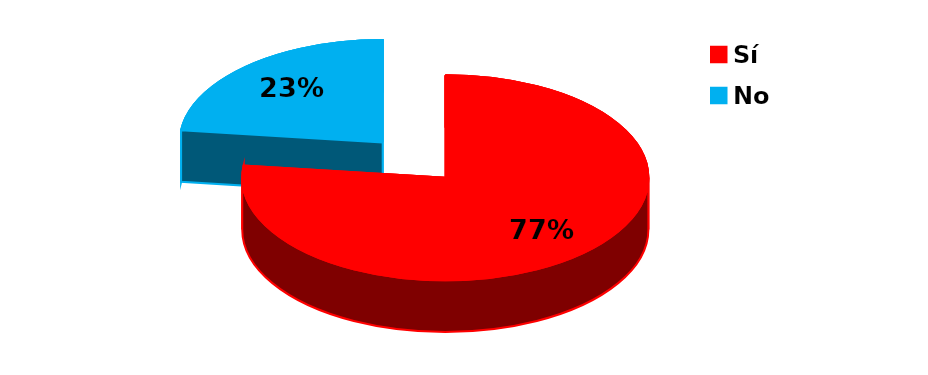
| Category | Series 0 |
|---|---|
| Sí | 10 |
| No | 3 |